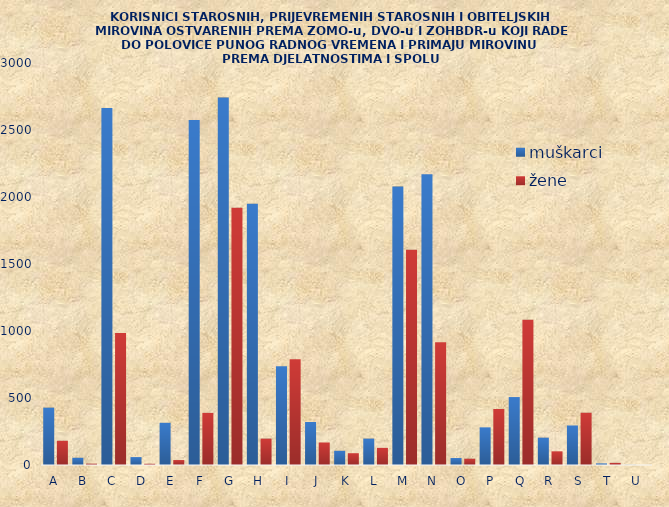
| Category | muškarci | žene |
|---|---|---|
| A | 428 | 181 |
| B | 54 | 10 |
| C | 2664 | 985 |
| D | 59 | 9 |
| E | 315 | 37 |
| F | 2575 | 389 |
| G | 2742 | 1920 |
| H | 1949 | 197 |
| I | 737 | 789 |
| J | 321 | 168 |
| K | 106 | 88 |
| L | 197 | 128 |
| M | 2078 | 1606 |
| N | 2170 | 916 |
| O | 52 | 47 |
| P | 281 | 418 |
| Q | 507 | 1084 |
| R | 204 | 102 |
| S | 295 | 390 |
| T | 12 | 16 |
| U | 1 | 0 |